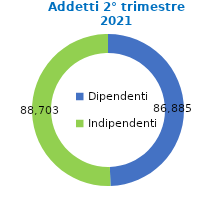
| Category | Fino a 9 addetti |
|---|---|
| Dipendenti | 86885 |
| Indipendenti | 88703 |